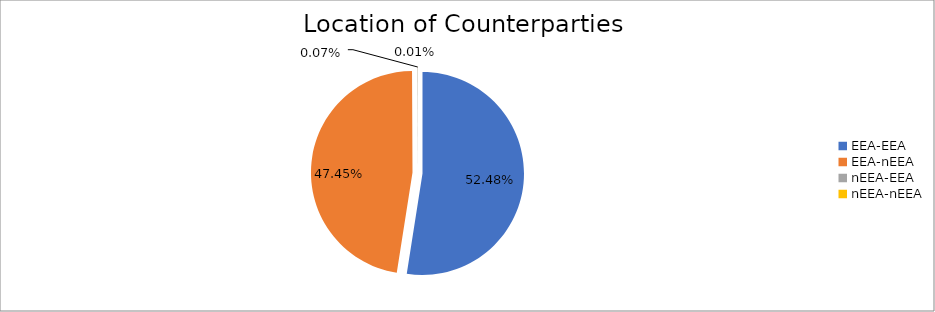
| Category | Series 0 |
|---|---|
| EEA-EEA | 6631831.699 |
| EEA-nEEA | 5996016.231 |
| nEEA-EEA | 8346.429 |
| nEEA-nEEA | 1095.43 |